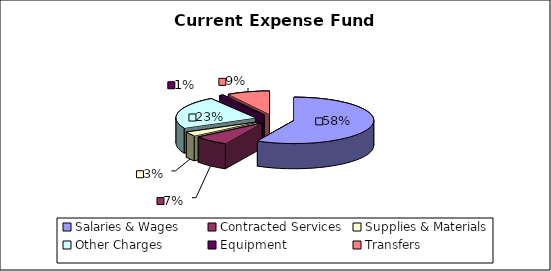
| Category | Series 0 |
|---|---|
| Salaries & Wages | 6868542705.36 |
| Contracted Services | 852277301.01 |
| Supplies & Materials | 356497563.42 |
| Other Charges | 2719106280.79 |
| Equipment | 94962876.81 |
| Transfers | 1029781582.38 |